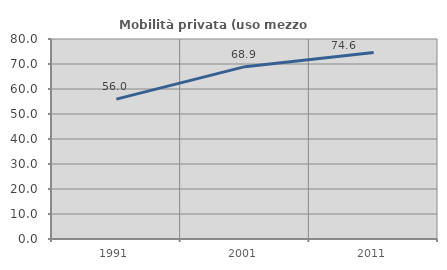
| Category | Mobilità privata (uso mezzo privato) |
|---|---|
| 1991.0 | 55.952 |
| 2001.0 | 68.946 |
| 2011.0 | 74.618 |